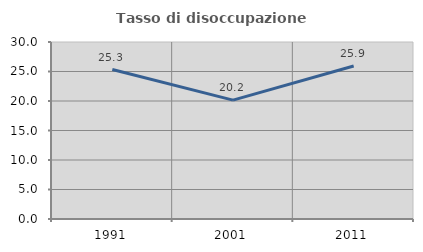
| Category | Tasso di disoccupazione giovanile  |
|---|---|
| 1991.0 | 25.333 |
| 2001.0 | 20.155 |
| 2011.0 | 25.926 |